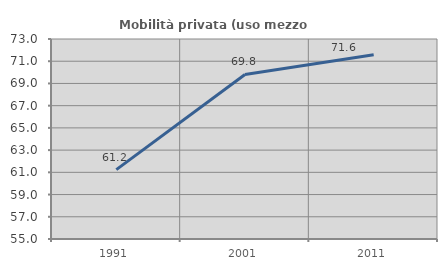
| Category | Mobilità privata (uso mezzo privato) |
|---|---|
| 1991.0 | 61.243 |
| 2001.0 | 69.809 |
| 2011.0 | 71.588 |